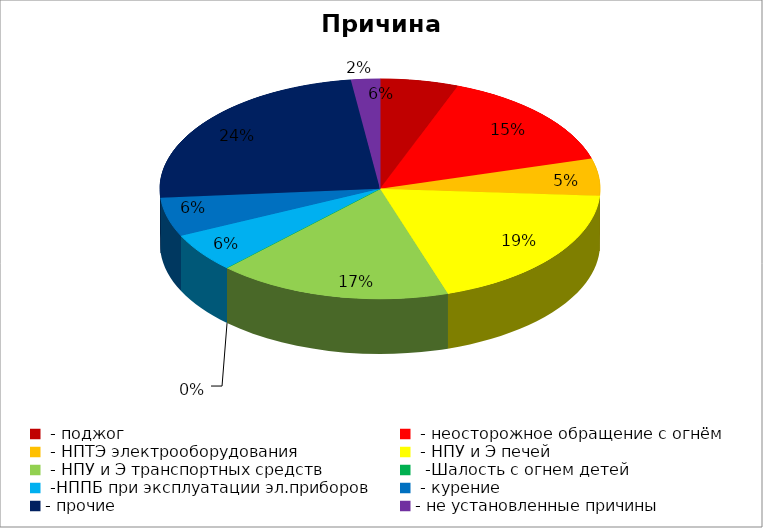
| Category | Причина пожара |
|---|---|
|  - поджог | 19 |
|  - неосторожное обращение с огнём | 49 |
|  - НПТЭ электрооборудования | 18 |
|  - НПУ и Э печей | 63 |
|  - НПУ и Э транспортных средств | 57 |
|   -Шалость с огнем детей | 0 |
|  -НППБ при эксплуатации эл.приборов | 19 |
|  - курение | 19 |
| - прочие | 80 |
| - не установленные причины | 7 |